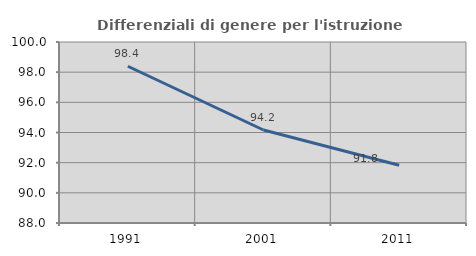
| Category | Differenziali di genere per l'istruzione superiore |
|---|---|
| 1991.0 | 98.393 |
| 2001.0 | 94.166 |
| 2011.0 | 91.827 |